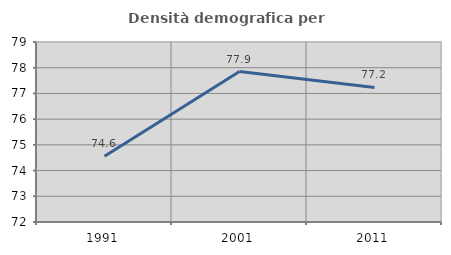
| Category | Densità demografica |
|---|---|
| 1991.0 | 74.555 |
| 2001.0 | 77.852 |
| 2011.0 | 77.234 |